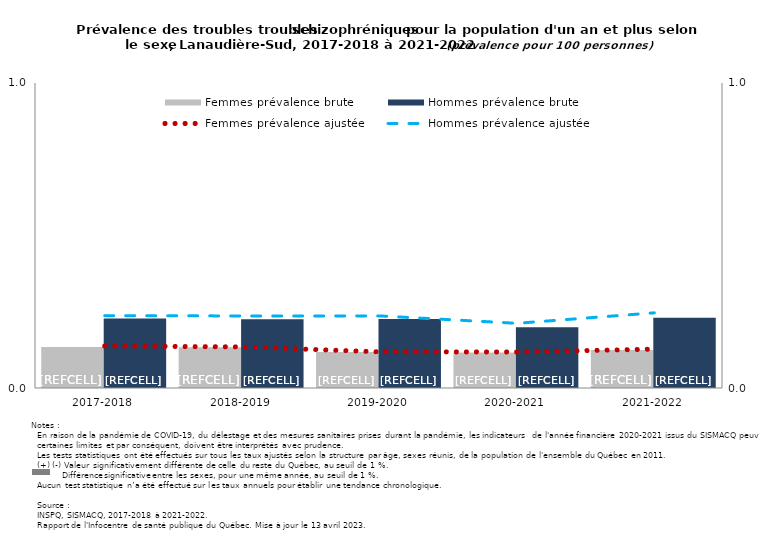
| Category | Femmes prévalence brute | Hommes prévalence brute |
|---|---|---|
| 2017-2018 | 0.135 | 0.228 |
| 2018-2019 | 0.134 | 0.226 |
| 2019-2020 | 0.118 | 0.226 |
| 2020-2021 | 0.116 | 0.199 |
| 2021-2022 | 0.125 | 0.23 |